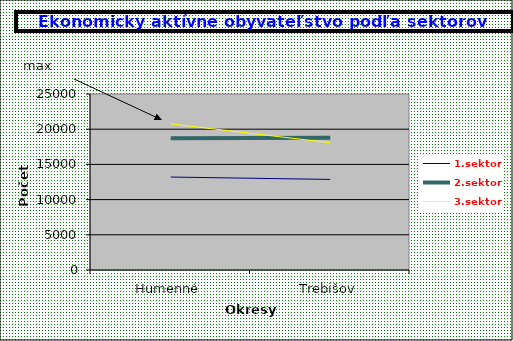
| Category | 1.sektor | 2.sektor | 3.sektor |
|---|---|---|---|
| Humenné | 13204 | 18702 | 20760 |
| Trebišov | 12865 | 18803 | 18076 |